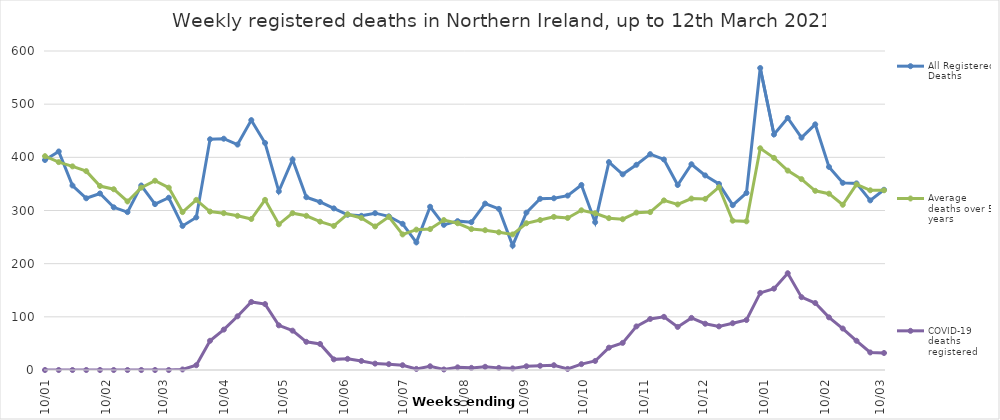
| Category | All Registered Deaths | Average deaths over 5 years | COVID-19 deaths registered |
|---|---|---|---|
| 2020-01-10 | 395 | 402.2 | 0 |
| 2020-01-17 | 411 | 391 | 0 |
| 2020-01-24 | 347 | 383 | 0 |
| 2020-01-31 | 323 | 374 | 0 |
| 2020-02-07 | 332 | 346 | 0 |
| 2020-02-14 | 306 | 340 | 0 |
| 2020-02-21 | 297 | 317 | 0 |
| 2020-02-28 | 347 | 343 | 0 |
| 2020-03-06 | 312 | 356 | 0 |
| 2020-03-13 | 324 | 343 | 0 |
| 2020-03-20 | 271 | 297 | 1 |
| 2020-03-27 | 287 | 320 | 9 |
| 2020-04-03 | 434 | 298 | 55 |
| 2020-04-10 | 435 | 295 | 76 |
| 2020-04-17 | 424 | 290 | 101 |
| 2020-04-24 | 470 | 284 | 128 |
| 2020-05-01 | 427 | 320 | 124 |
| 2020-05-08 | 336 | 274 | 84 |
| 2020-05-15 | 396 | 295 | 74 |
| 2020-05-22 | 325 | 290 | 53 |
| 2020-05-29 | 316 | 279 | 49 |
| 2020-06-05 | 304 | 271 | 20 |
| 2020-06-12 | 292 | 293 | 21 |
| 2020-06-19 | 290 | 286 | 17 |
| 2020-06-26 | 295 | 270 | 12 |
| 2020-07-03 | 289 | 288 | 11 |
| 2020-07-10 | 275 | 255 | 9 |
| 2020-07-17 | 240 | 264 | 2 |
| 2020-07-24 | 307 | 265 | 7 |
| 2020-07-31 | 273 | 282 | 1 |
| 2020-08-07 | 280 | 276 | 5 |
| 2020-08-14 | 278 | 265 | 4 |
| 2020-08-21 | 313 | 263 | 6 |
| 2020-08-28 | 303 | 259 | 4 |
| 2020-09-04 | 234 | 255 | 3 |
| 2020-09-11 | 296 | 276 | 7 |
| 2020-09-18 | 322 | 282 | 8 |
| 2020-09-25 | 323 | 288 | 9 |
| 2020-10-02 | 328 | 286 | 2 |
| 2020-10-09 | 348 | 300.4 | 11 |
| 2020-10-16 | 278 | 294.8 | 17 |
| 2020-10-23 | 391 | 285.6 | 42 |
| 2020-10-30 | 368 | 283.6 | 51 |
| 2020-11-06 | 386 | 296 | 82 |
| 2020-11-13 | 406 | 297 | 96 |
| 2020-11-20 | 396 | 319 | 100 |
| 2020-11-27 | 348 | 311.4 | 81 |
| 2020-12-04 | 387 | 322.4 | 98 |
| 2020-12-11 | 366 | 321.8 | 87 |
| 2020-12-18 | 350 | 343.8 | 82 |
| 2020-12-25 | 310 | 280.8 | 88 |
| 2021-01-01 | 333 | 279.6 | 94 |
| 2021-01-08 | 568 | 417 | 145 |
| 2021-01-15 | 443 | 399 | 153 |
| 2021-01-22 | 474 | 375 | 182 |
| 2021-01-29 | 437 | 359 | 137 |
| 2021-02-05 | 462 | 337 | 126 |
| 2021-02-12 | 382 | 331.6 | 99 |
| 2021-02-19 | 352 | 310.8 | 78 |
| 2021-02-26 | 351 | 349 | 55 |
| 2021-03-05 | 319 | 338 | 33 |
| 2021-03-12 | 339 | 338 | 32 |